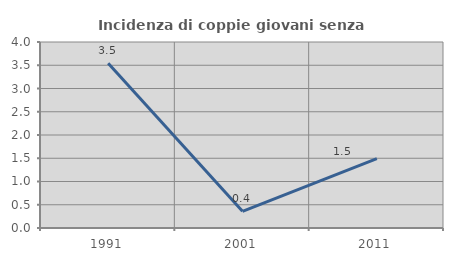
| Category | Incidenza di coppie giovani senza figli |
|---|---|
| 1991.0 | 3.542 |
| 2001.0 | 0.358 |
| 2011.0 | 1.493 |